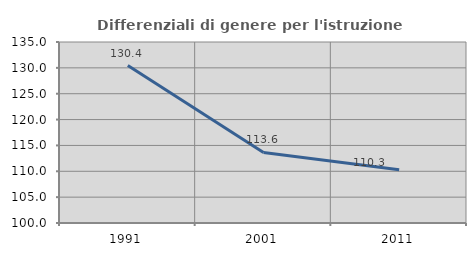
| Category | Differenziali di genere per l'istruzione superiore |
|---|---|
| 1991.0 | 130.439 |
| 2001.0 | 113.638 |
| 2011.0 | 110.285 |